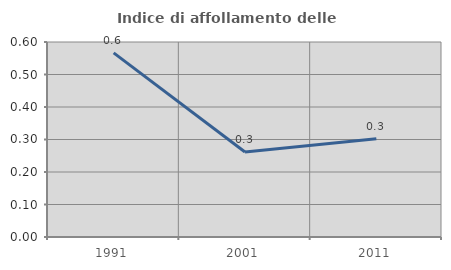
| Category | Indice di affollamento delle abitazioni  |
|---|---|
| 1991.0 | 0.567 |
| 2001.0 | 0.261 |
| 2011.0 | 0.302 |